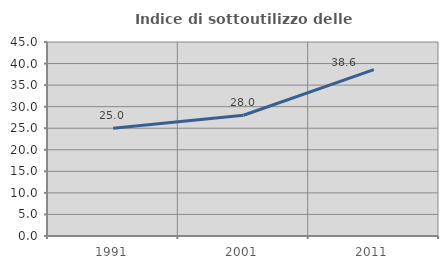
| Category | Indice di sottoutilizzo delle abitazioni  |
|---|---|
| 1991.0 | 25 |
| 2001.0 | 28.016 |
| 2011.0 | 38.609 |